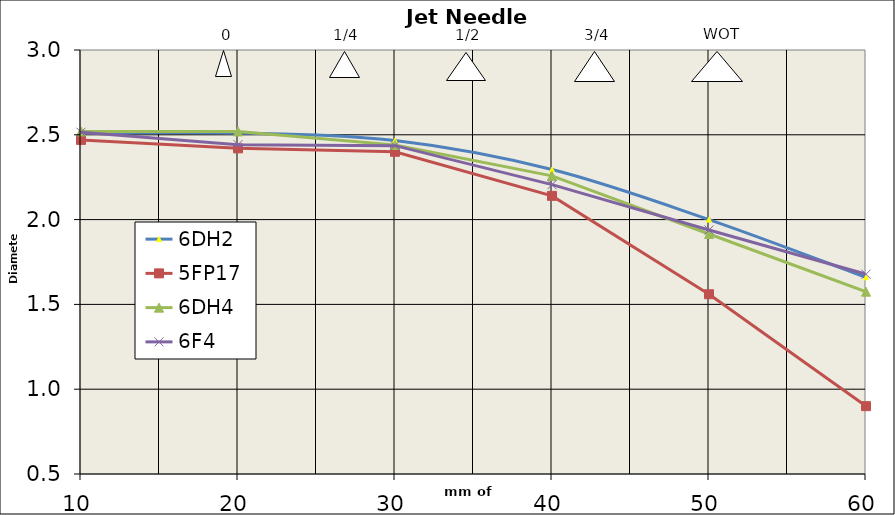
| Category | 6DH2 | 5FP17 | 6DH4 | 6F4 |
|---|---|---|---|---|
| 10.0 | 2.511 | 2.47 | 2.52 | 2.515 |
| 20.0 | 2.511 | 2.42 | 2.52 | 2.442 |
| 30.0 | 2.466 | 2.4 | 2.44 | 2.436 |
| 40.0 | 2.295 | 2.14 | 2.258 | 2.206 |
| 50.0 | 2 | 1.56 | 1.915 | 1.939 |
| 60.0 | 1.66 | 0.9 | 1.575 | 1.678 |